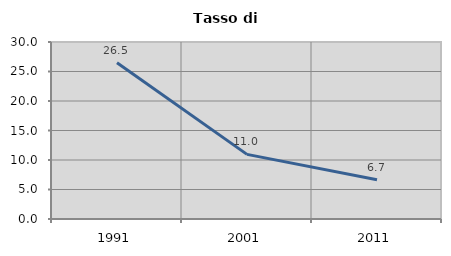
| Category | Tasso di disoccupazione   |
|---|---|
| 1991.0 | 26.486 |
| 2001.0 | 10.951 |
| 2011.0 | 6.667 |